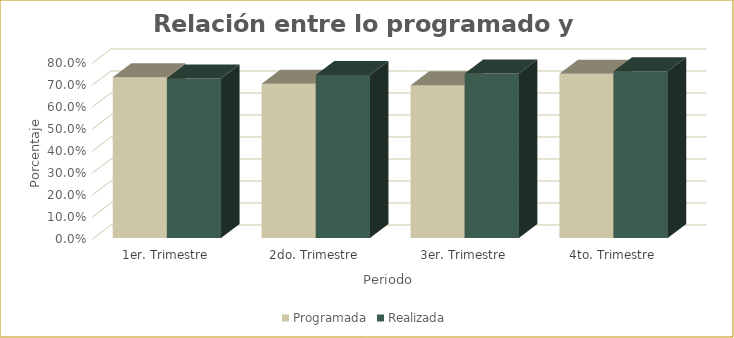
| Category | Programada | Realizada |
|---|---|---|
| 1er. Trimestre | 0.73 | 0.725 |
| 2do. Trimestre | 0.701 | 0.741 |
| 3er. Trimestre | 0.694 | 0.748 |
| 4to. Trimestre | 0.746 | 0.758 |